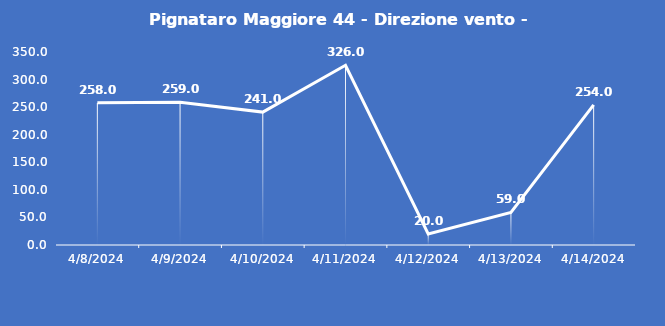
| Category | Pignataro Maggiore 44 - Direzione vento - Grezzo (°N) |
|---|---|
| 4/8/24 | 258 |
| 4/9/24 | 259 |
| 4/10/24 | 241 |
| 4/11/24 | 326 |
| 4/12/24 | 20 |
| 4/13/24 | 59 |
| 4/14/24 | 254 |